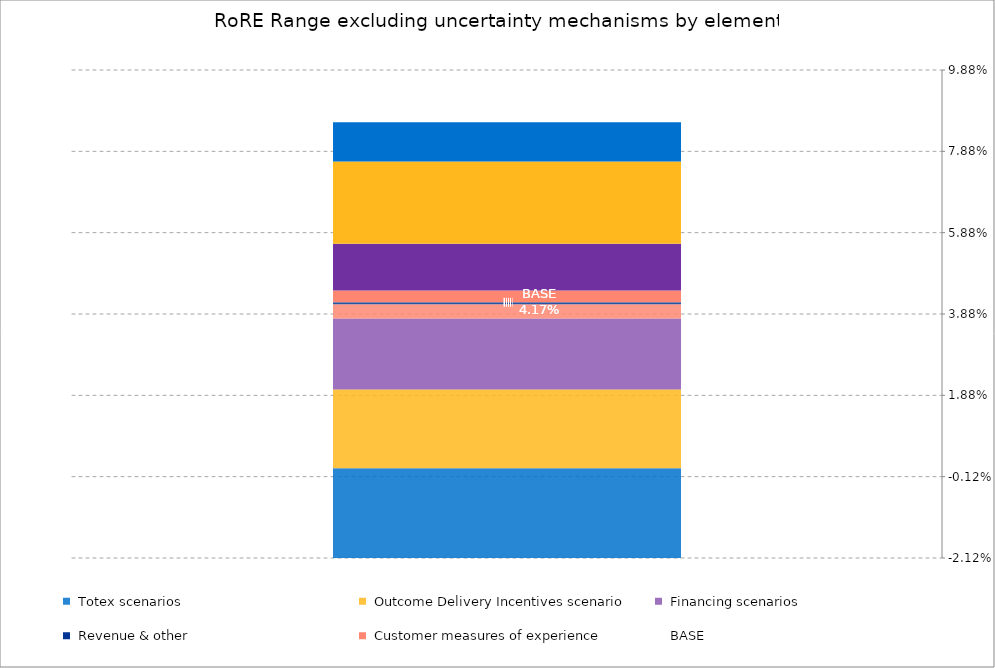
| Category | Minimum | Totex scenarios | Outcome Delivery Incentives scenario | Financing scenarios | Customer measures of experience | Revenue & other | Series 21 | Series 22 | Series 23 | Series 24 | Series 25 | Series 26 | Series 27 | Series 28 |
|---|---|---|---|---|---|---|---|---|---|---|---|---|---|---|
| RoRE Base case | 0 | 0.01 | 0.02 | 0.011 | 0.003 | 0 |  |  |  |  |  |  |  |  |